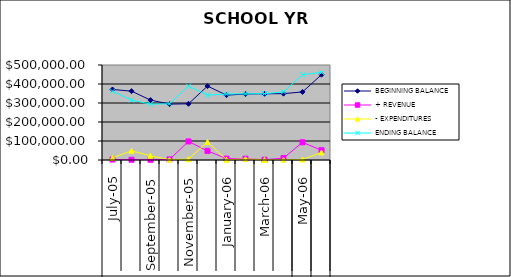
| Category | BEGINNING BALANCE | + REVENUE | - EXPENDITURES | ENDING BALANCE |
|---|---|---|---|---|
| 0 | 371097.18 | 2467.33 | 11204.95 | 362359.56 |
| 1 | 362359.56 | 1175.45 | 48237.58 | 315297.43 |
| 2 | 315297.43 | 1055.84 | 22153.9 | 294199.37 |
| 3 | 294199.37 | 3162.46 | 1545.88 | 295815.95 |
| 4 | 295815.95 | 97739.04 | 4555.91 | 388999.08 |
| 5 | 388999.08 | 47919.7 | 95625.89 | 341292.89 |
| 6 | 341292.89 | 7425.04 | 1591.08 | 347126.85 |
| 7 | 347126.85 | 6888.48 | 5633.43 | 348381.9 |
| 8 | 348381.9 | 1278.45 | 556.36 | 349103.99 |
| 9 | 349103.99 | 10086.64 | 832.51 | 358358.12 |
| 10 | 358358.12 | 93149.87 | 2593.97 | 448914.02 |
| 11 | 448914.02 | 51421.81 | 39312.31 | 461023.52 |